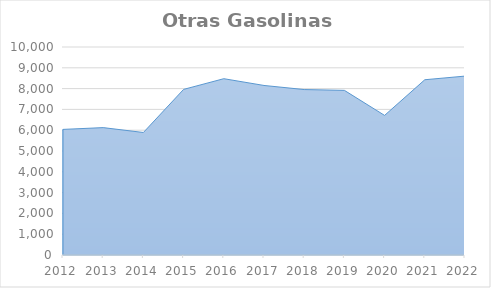
| Category | Otras Gasolinas |
|---|---|
| 2012.0 | 6038.235 |
| 2013.0 | 6124.077 |
| 2014.0 | 5890.162 |
| 2015.0 | 7961.893 |
| 2016.0 | 8475.881 |
| 2017.0 | 8150.812 |
| 2018.0 | 7954.157 |
| 2019.0 | 7914.916 |
| 2020.0 | 6711.472 |
| 2021.0 | 8425.671 |
| 2022.0 | 8600.77 |